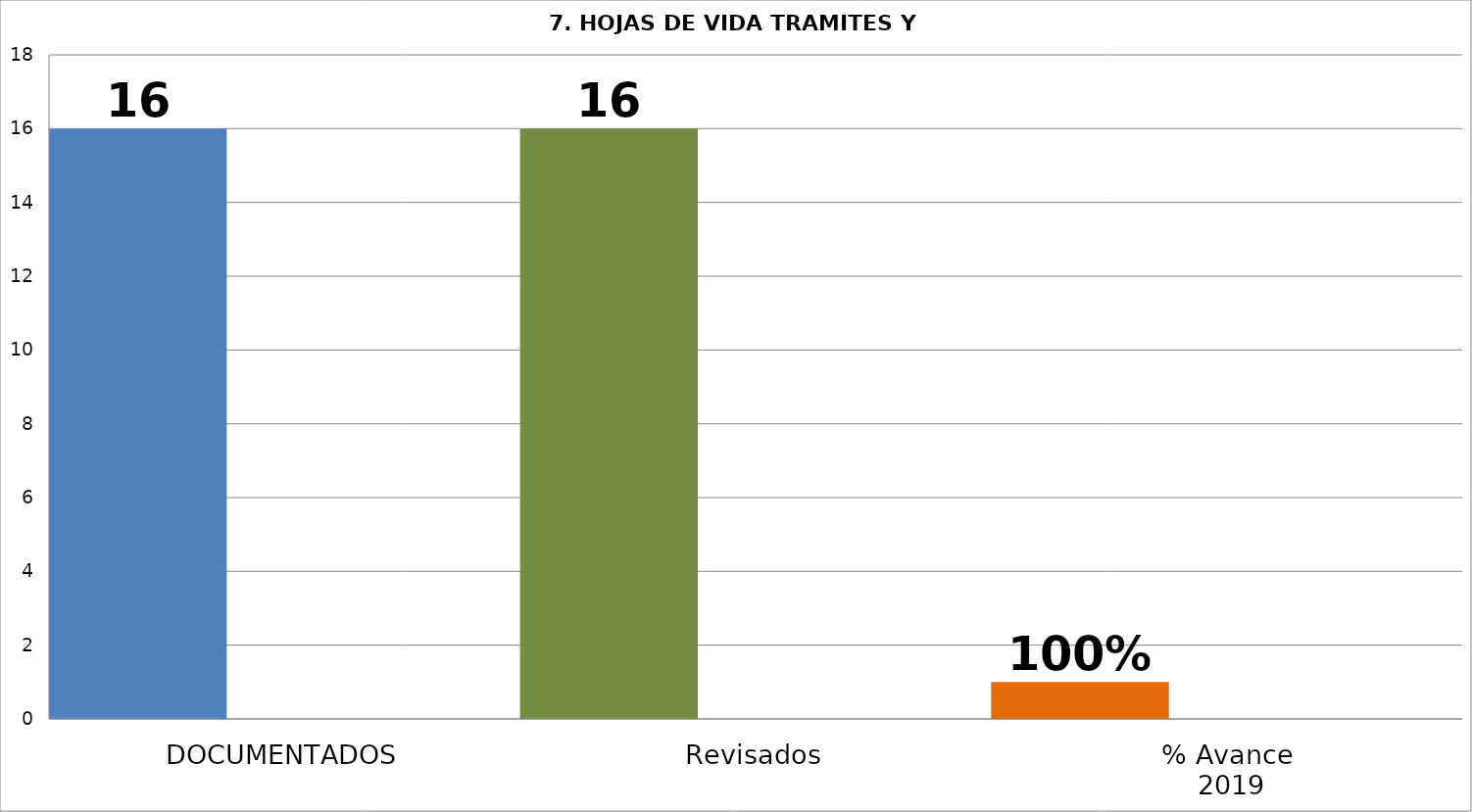
| Category | Series 2 | Series 4 | Series 0 | Series 1 | Series 10 | Series 12 | Series 13 | Series 14 | Series 15 | Series 17 | Series 18 | Series 20 | Series 21 | Series 25 |
|---|---|---|---|---|---|---|---|---|---|---|---|---|---|---|
| DOCUMENTADOS | 16 |  |  |  |  |  |  |  |  |  |  |  |  |  |
| Revisados | 16 |  |  |  |  |  |  |  |  |  |  |  |  |  |
| % Avance
 2019 | 1 |  |  |  |  |  |  |  |  |  |  |  |  |  |